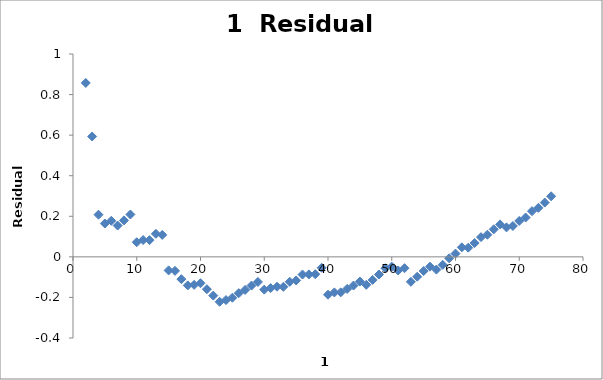
| Category | Series 0 |
|---|---|
| 2.0 | 0.857 |
| 3.0 | 0.593 |
| 4.0 | 0.208 |
| 5.0 | 0.164 |
| 6.0 | 0.178 |
| 7.0 | 0.154 |
| 8.0 | 0.18 |
| 9.0 | 0.209 |
| 10.0 | 0.072 |
| 11.0 | 0.083 |
| 12.0 | 0.083 |
| 13.0 | 0.113 |
| 14.0 | 0.108 |
| 15.0 | -0.067 |
| 16.0 | -0.069 |
| 17.0 | -0.11 |
| 18.0 | -0.141 |
| 19.0 | -0.138 |
| 20.0 | -0.13 |
| 21.0 | -0.16 |
| 22.0 | -0.191 |
| 23.0 | -0.221 |
| 24.0 | -0.213 |
| 25.0 | -0.201 |
| 26.0 | -0.179 |
| 27.0 | -0.163 |
| 28.0 | -0.142 |
| 29.0 | -0.124 |
| 30.0 | -0.161 |
| 31.0 | -0.154 |
| 32.0 | -0.147 |
| 33.0 | -0.148 |
| 34.0 | -0.123 |
| 35.0 | -0.116 |
| 36.0 | -0.087 |
| 37.0 | -0.087 |
| 38.0 | -0.086 |
| 39.0 | -0.054 |
| 40.0 | -0.187 |
| 41.0 | -0.175 |
| 42.0 | -0.175 |
| 43.0 | -0.158 |
| 44.0 | -0.141 |
| 45.0 | -0.122 |
| 46.0 | -0.138 |
| 47.0 | -0.114 |
| 48.0 | -0.087 |
| 49.0 | -0.056 |
| 50.0 | -0.048 |
| 51.0 | -0.067 |
| 52.0 | -0.056 |
| 53.0 | -0.123 |
| 54.0 | -0.098 |
| 55.0 | -0.07 |
| 56.0 | -0.048 |
| 57.0 | -0.063 |
| 58.0 | -0.039 |
| 59.0 | -0.007 |
| 60.0 | 0.016 |
| 61.0 | 0.047 |
| 62.0 | 0.045 |
| 63.0 | 0.068 |
| 64.0 | 0.097 |
| 65.0 | 0.109 |
| 66.0 | 0.136 |
| 67.0 | 0.16 |
| 68.0 | 0.145 |
| 69.0 | 0.152 |
| 70.0 | 0.177 |
| 71.0 | 0.194 |
| 72.0 | 0.225 |
| 73.0 | 0.242 |
| 74.0 | 0.268 |
| 75.0 | 0.298 |